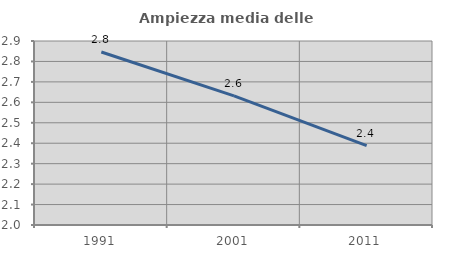
| Category | Ampiezza media delle famiglie |
|---|---|
| 1991.0 | 2.846 |
| 2001.0 | 2.632 |
| 2011.0 | 2.388 |